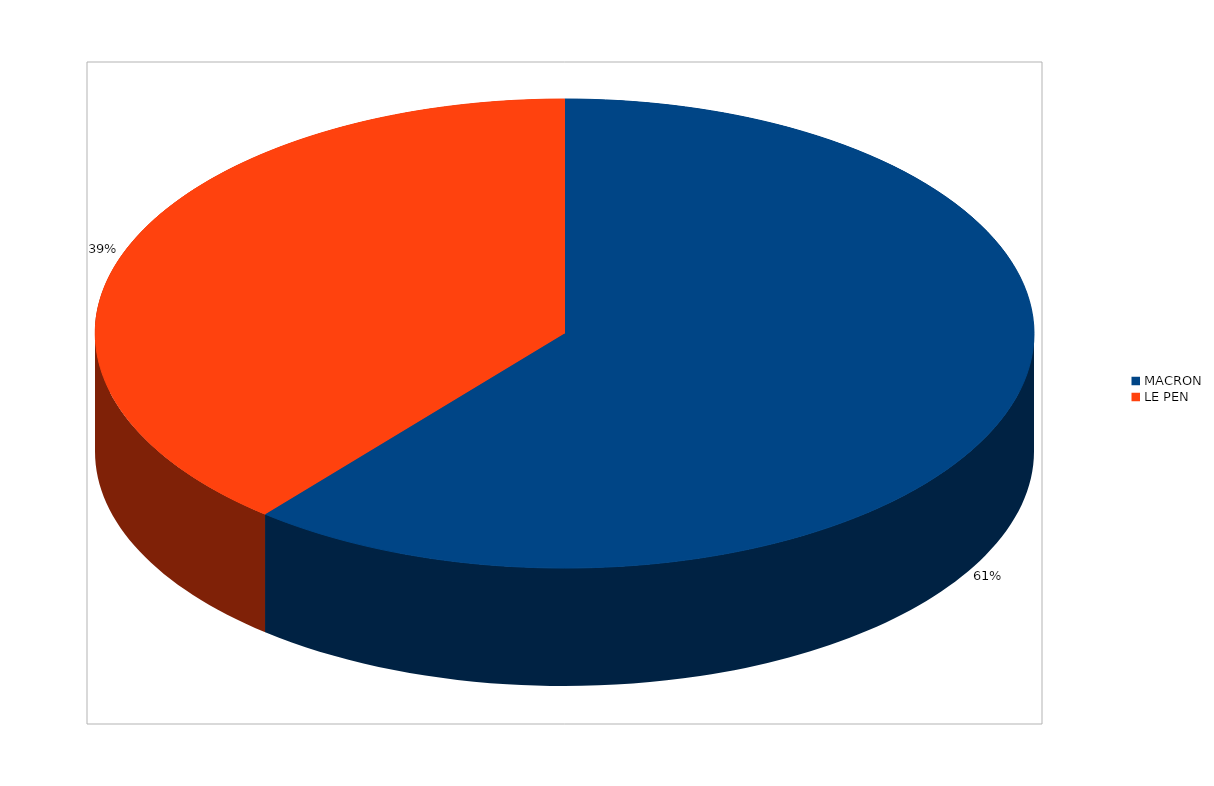
| Category | Series 0 |
|---|---|
| MACRON | 2856 |
| LE PEN | 1826 |